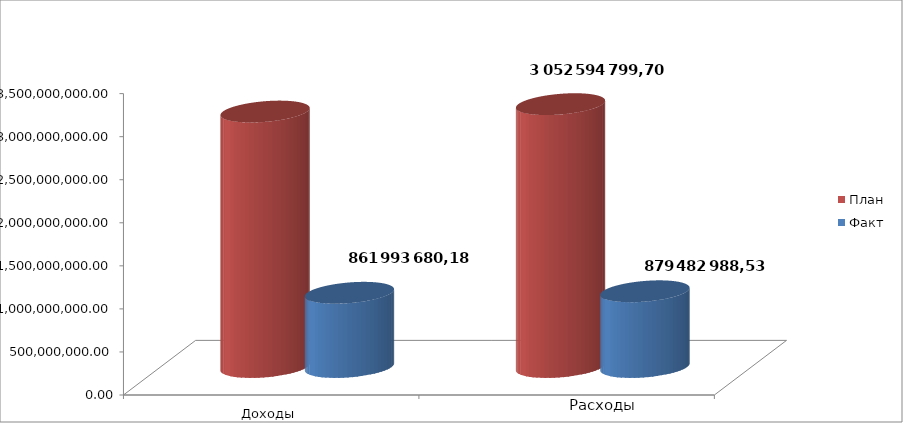
| Category | План | Факт |
|---|---|---|
| 0 | 2966712257.72 | 861993680.18 |
| 1 | 3052594799.7 | 879482988.53 |